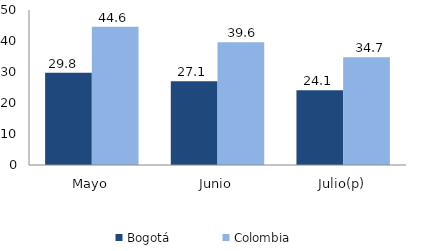
| Category | Bogotá | Colombia |
|---|---|---|
| Mayo | 29.756 | 44.597 |
| Junio | 27.053 | 39.557 |
| Julio(p) | 24.139 | 34.742 |